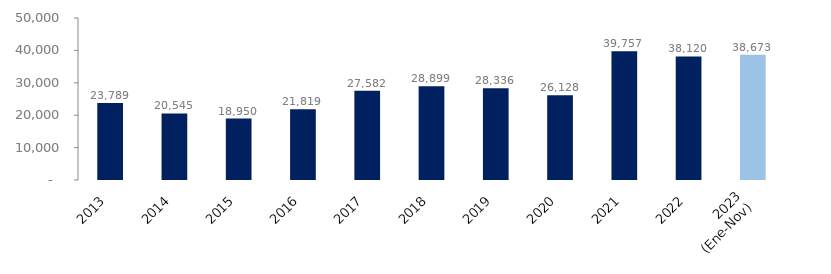
| Category | Series 1 |
|---|---|
| 2013 | 23789.445 |
| 2014 | 20545.414 |
| 2015 | 18950.14 |
| 2016 | 21819.079 |
| 2017 | 27581.607 |
| 2018 | 28898.658 |
| 2019 | 28336.208 |
| 2020 | 26127.692 |
| 2021 | 39756.503 |
| 2022 | 38119.865 |
| 2023
(Ene-Nov) | 38673.437 |